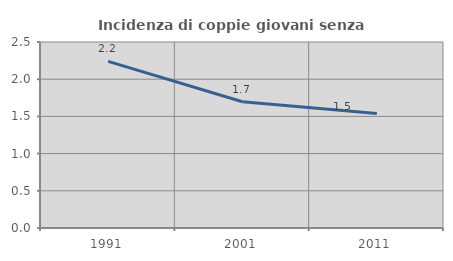
| Category | Incidenza di coppie giovani senza figli |
|---|---|
| 1991.0 | 2.239 |
| 2001.0 | 1.697 |
| 2011.0 | 1.539 |